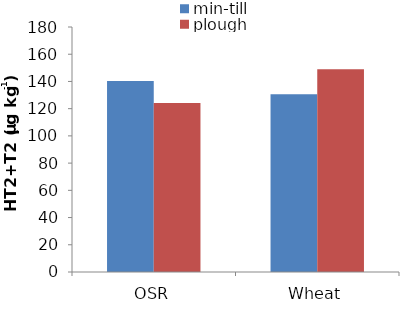
| Category | min-till | plough |
|---|---|---|
| OSR | 140.281 | 124.165 |
| Wheat | 130.617 | 148.936 |